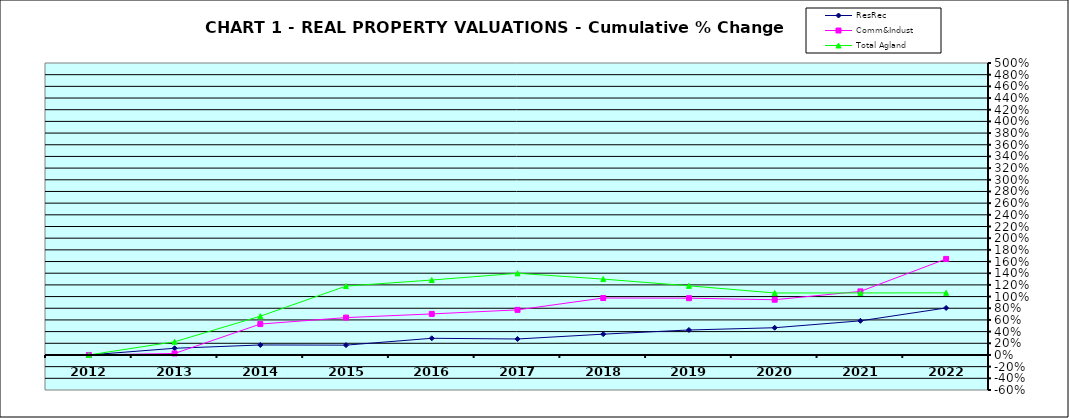
| Category | ResRec | Comm&Indust | Total Agland |
|---|---|---|---|
| 2012.0 | 0 | 0 | 0 |
| 2013.0 | 0.115 | 0.026 | 0.226 |
| 2014.0 | 0.171 | 0.529 | 0.664 |
| 2015.0 | 0.168 | 0.64 | 1.18 |
| 2016.0 | 0.286 | 0.703 | 1.283 |
| 2017.0 | 0.274 | 0.772 | 1.399 |
| 2018.0 | 0.356 | 0.976 | 1.3 |
| 2019.0 | 0.428 | 0.972 | 1.184 |
| 2020.0 | 0.466 | 0.946 | 1.062 |
| 2021.0 | 0.585 | 1.089 | 1.062 |
| 2022.0 | 0.805 | 1.645 | 1.064 |